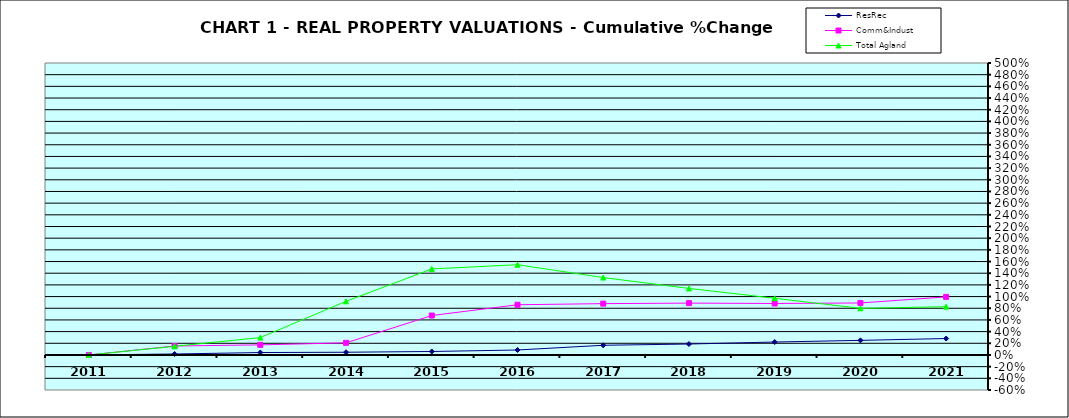
| Category | ResRec | Comm&Indust | Total Agland |
|---|---|---|---|
| 2011.0 | 0 | 0 | 0 |
| 2012.0 | 0.017 | 0.154 | 0.148 |
| 2013.0 | 0.041 | 0.173 | 0.298 |
| 2014.0 | 0.047 | 0.208 | 0.918 |
| 2015.0 | 0.06 | 0.675 | 1.474 |
| 2016.0 | 0.085 | 0.86 | 1.546 |
| 2017.0 | 0.166 | 0.879 | 1.326 |
| 2018.0 | 0.187 | 0.888 | 1.14 |
| 2019.0 | 0.222 | 0.882 | 0.971 |
| 2020.0 | 0.25 | 0.89 | 0.798 |
| 2021.0 | 0.281 | 0.994 | 0.827 |